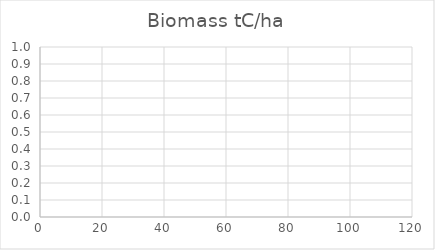
| Category | Biomass tC/ha |
|---|---|
| 4.0 | 0 |
| 5.0 | 0 |
| 6.0 | 0 |
| 7.0 | 0 |
| 8.0 | 0 |
| 9.0 | 0 |
| 10.0 | 0 |
| 11.0 | 0 |
| 12.0 | 0 |
| 13.0 | 0 |
| 14.0 | 0 |
| 15.0 | 0 |
| 16.0 | 0 |
| 17.0 | 0 |
| 18.0 | 0 |
| 19.0 | 0 |
| 20.0 | 0 |
| 21.0 | 0 |
| 22.0 | 0 |
| 23.0 | 0 |
| 24.0 | 0 |
| 25.0 | 0 |
| 26.0 | 0 |
| 27.0 | 0 |
| 28.0 | 0 |
| 29.0 | 0 |
| 30.0 | 0 |
| 31.0 | 0 |
| 32.0 | 0 |
| 33.0 | 0 |
| 34.0 | 0 |
| 35.0 | 0 |
| 36.0 | 0 |
| 37.0 | 0 |
| 38.0 | 0 |
| 39.0 | 0 |
| 40.0 | 0 |
| 41.0 | 0 |
| 42.0 | 0 |
| 43.0 | 0 |
| 44.0 | 0 |
| 45.0 | 0 |
| 46.0 | 0 |
| 47.0 | 0 |
| 48.0 | 0 |
| 49.0 | 0 |
| 50.0 | 0 |
| 51.0 | 0 |
| 52.0 | 0 |
| 53.0 | 0 |
| 54.0 | 0 |
| 55.0 | 0 |
| 56.0 | 0 |
| 57.0 | 0 |
| 58.0 | 0 |
| 59.0 | 0 |
| 60.0 | 0 |
| 61.0 | 0 |
| 62.0 | 0 |
| 63.0 | 0 |
| 64.0 | 0 |
| 65.0 | 0 |
| 66.0 | 0 |
| 67.0 | 0 |
| 68.0 | 0 |
| 69.0 | 0 |
| 70.0 | 0 |
| 71.0 | 0 |
| 72.0 | 0 |
| 73.0 | 0 |
| 74.0 | 0 |
| 75.0 | 0 |
| 76.0 | 0 |
| 77.0 | 0 |
| 78.0 | 0 |
| 79.0 | 0 |
| 80.0 | 0 |
| 81.0 | 0 |
| 82.0 | 0 |
| 83.0 | 0 |
| 84.0 | 0 |
| 85.0 | 0 |
| 86.0 | 0 |
| 87.0 | 0 |
| 88.0 | 0 |
| 89.0 | 0 |
| 90.0 | 0 |
| 91.0 | 0 |
| 92.0 | 0 |
| 93.0 | 0 |
| 94.0 | 0 |
| 95.0 | 0 |
| 96.0 | 0 |
| 97.0 | 0 |
| 98.0 | 0 |
| 99.0 | 0 |
| 100.0 | 0 |